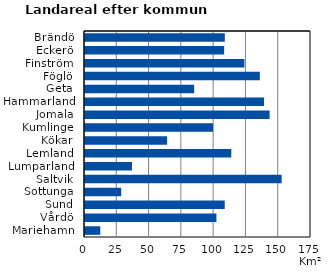
| Category | Series 0 |
|---|---|
| Brändö | 108.28 |
| Eckerö | 107.74 |
| Finström | 123.44 |
| Föglö | 135.37 |
| Geta | 84.55 |
| Hammarland | 138.63 |
| Jomala | 142.96 |
| Kumlinge | 99.17 |
| Kökar | 63.59 |
| Lemland | 113.3 |
| Lumparland | 36.4 |
| Saltvik | 152.28 |
| Sottunga | 28.05 |
| Sund | 108.21 |
| Vårdö | 101.79 |
| Mariehamn | 11.83 |